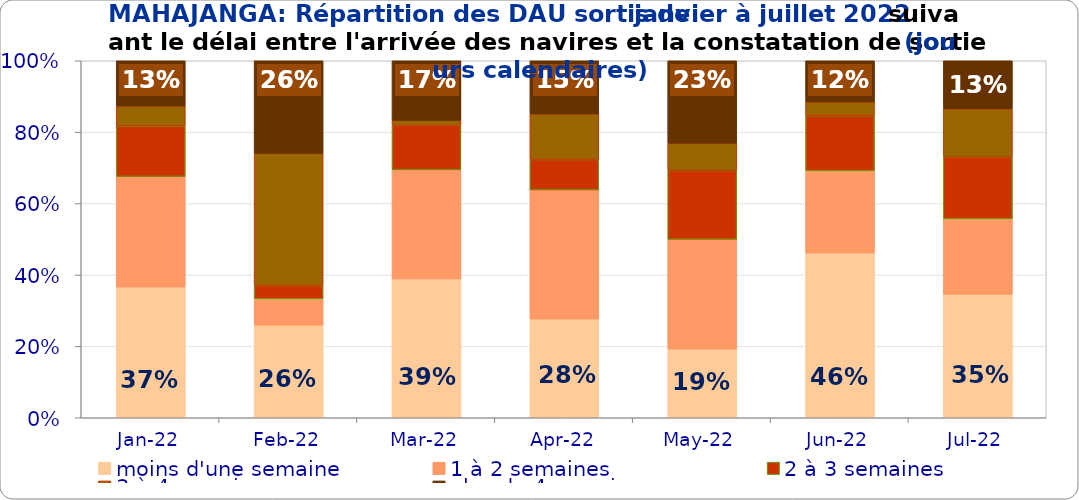
| Category | moins d'une semaine | 1 à 2 semaines | 2 à 3 semaines | 3 à 4 semaines | plus de 4 semaines |
|---|---|---|---|---|---|
| 2022-01-01 | 0.366 | 0.31 | 0.141 | 0.056 | 0.127 |
| 2022-02-01 | 0.259 | 0.074 | 0.037 | 0.37 | 0.259 |
| 2022-03-01 | 0.389 | 0.306 | 0.125 | 0.014 | 0.167 |
| 2022-04-01 | 0.277 | 0.362 | 0.085 | 0.128 | 0.149 |
| 2022-05-01 | 0.192 | 0.308 | 0.192 | 0.077 | 0.231 |
| 2022-06-01 | 0.462 | 0.231 | 0.154 | 0.038 | 0.115 |
| 2022-07-01 | 0.346 | 0.212 | 0.173 | 0.135 | 0.135 |